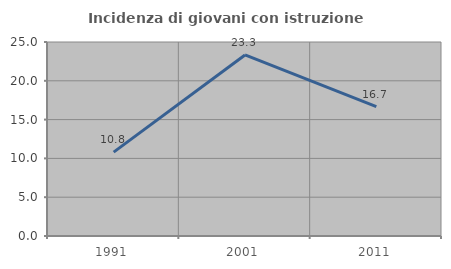
| Category | Incidenza di giovani con istruzione universitaria |
|---|---|
| 1991.0 | 10.811 |
| 2001.0 | 23.333 |
| 2011.0 | 16.667 |